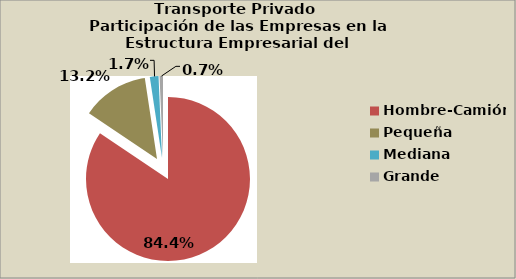
| Category | Series 0 |
|---|---|
| Hombre-Camión | 84.377 |
| Pequeña | 13.189 |
| Mediana | 1.7 |
| Grande | 0.676 |